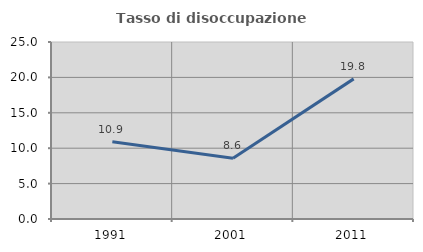
| Category | Tasso di disoccupazione giovanile  |
|---|---|
| 1991.0 | 10.904 |
| 2001.0 | 8.594 |
| 2011.0 | 19.792 |